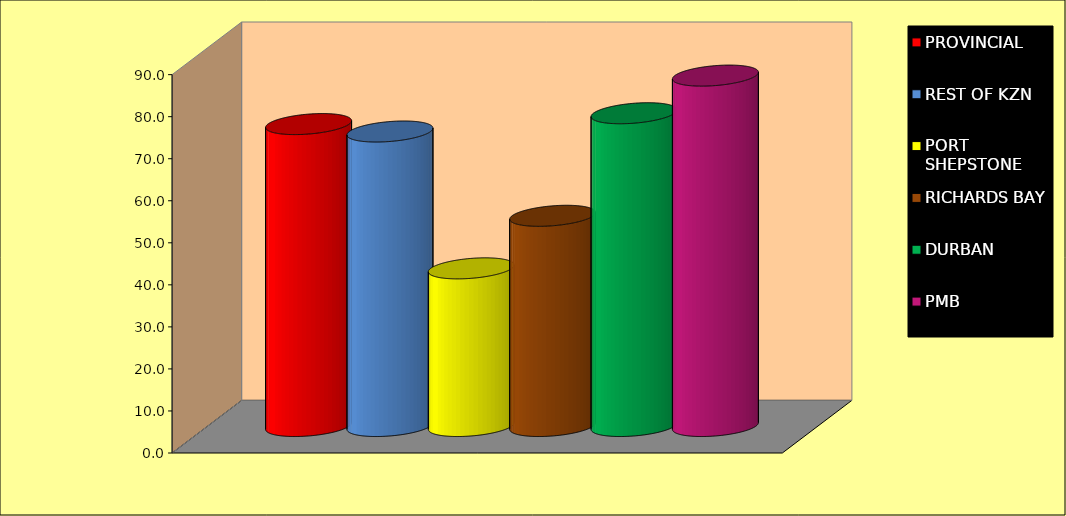
| Category | PROVINCIAL | REST OF KZN | PORT SHEPSTONE | RICHARDS BAY | DURBAN | PMB |
|---|---|---|---|---|---|---|
| 0 | 71.821 | 70.05 | 37.5 | 50 | 74.4 | 83.35 |